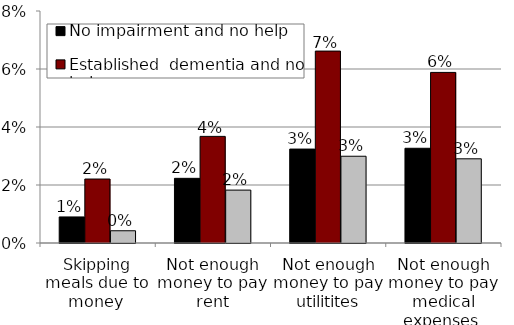
| Category | No impairment and no help | Established  dementia and no help  | Established dementia and help  |
|---|---|---|---|
| Skipping meals due to money  | 0.009 | 0.022 | 0.004 |
| Not enough money to pay rent | 0.022 | 0.037 | 0.018 |
| Not enough money to pay utilitites | 0.032 | 0.066 | 0.03 |
| Not enough money to pay medical expenses  | 0.033 | 0.059 | 0.029 |